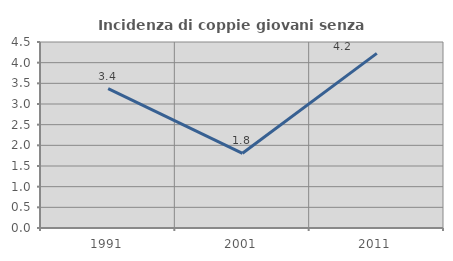
| Category | Incidenza di coppie giovani senza figli |
|---|---|
| 1991.0 | 3.371 |
| 2001.0 | 1.807 |
| 2011.0 | 4.225 |